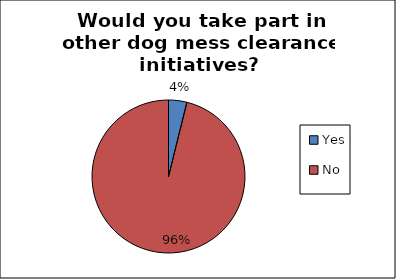
| Category | Series 0 |
|---|---|
| Yes | 0.039 |
| No | 0.961 |